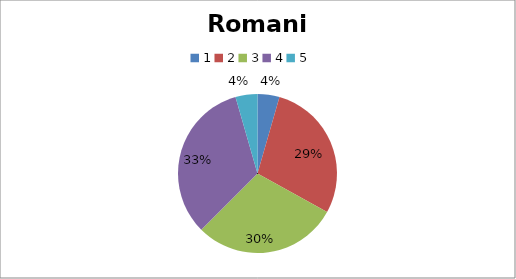
| Category | Romania |
|---|---|
| 0 | 5 |
| 1 | 32 |
| 2 | 33 |
| 3 | 37 |
| 4 | 5 |